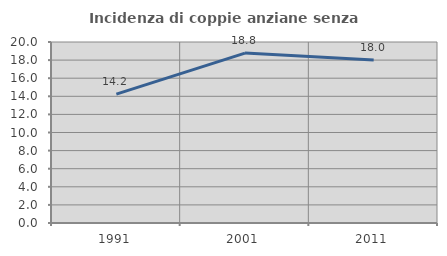
| Category | Incidenza di coppie anziane senza figli  |
|---|---|
| 1991.0 | 14.234 |
| 2001.0 | 18.778 |
| 2011.0 | 18.023 |